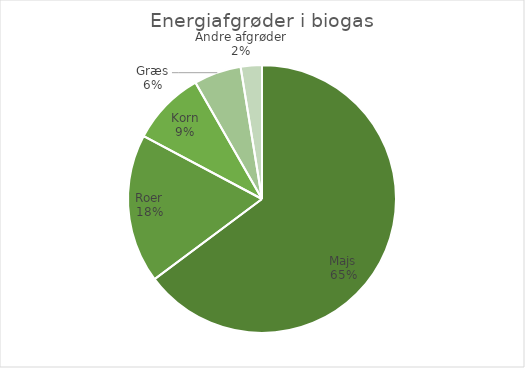
| Category | Series 0 |
|---|---|
| Majs | 69683.3 |
| Roer | 19335.6 |
| Korn | 9629.94 |
| Græs | 6135.9 |
| Andre afgrøder | 2754 |